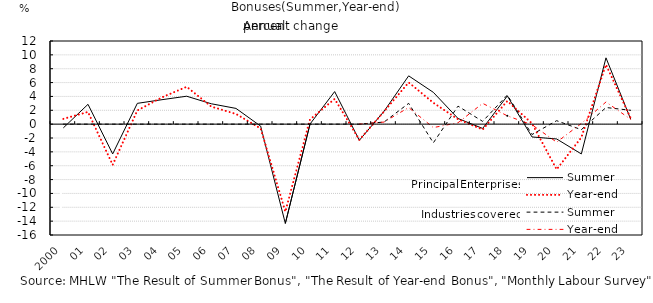
| Category | Summer | Year-end |
|---|---|---|
| 2000.0 | 0 | 0 |
| 1.0 | 0 | 0 |
| 2.0 | 0 | 0 |
| 3.0 | 0 | 0 |
| 4.0 | 0 | 0 |
| 5.0 | 0 | 0 |
| 6.0 | 0 | 0 |
| 7.0 | 0 | 0 |
| 8.0 | 0 | 0 |
| 9.0 | 0 | 0 |
| 10.0 | 0 | 0 |
| 11.0 | 0 | 0 |
| 12.0 | 0 | 0 |
| 13.0 | 0.3 | 0.3 |
| 14.0 | 3 | 2.4 |
| 15.0 | -2.7 | -0.5 |
| 16.0 | 2.6 | 0.2 |
| 17.0 | 0.4 | 3 |
| 18.0 | 4.2 | 1.2 |
| 19.0 | -1.5 | -0.1 |
| 20.0 | 0.5 | -2.6 |
| 21.0 | -0.8 | 0.1 |
| 22.0 | 2.4 | 3.2 |
| 23.0 | 2 | 0.7 |